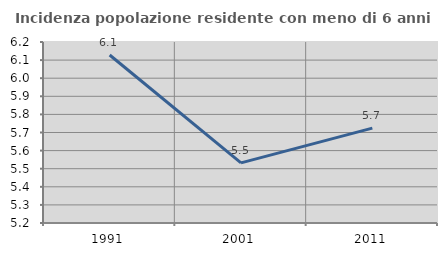
| Category | Incidenza popolazione residente con meno di 6 anni |
|---|---|
| 1991.0 | 6.128 |
| 2001.0 | 5.532 |
| 2011.0 | 5.724 |